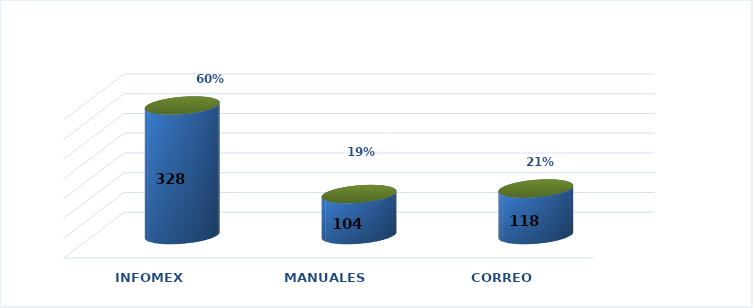
| Category | Series 0 | Series 1 |
|---|---|---|
| INFOMEX | 328 | 0.596 |
| MANUALES | 104 | 0.189 |
| CORREO | 118 | 0.215 |